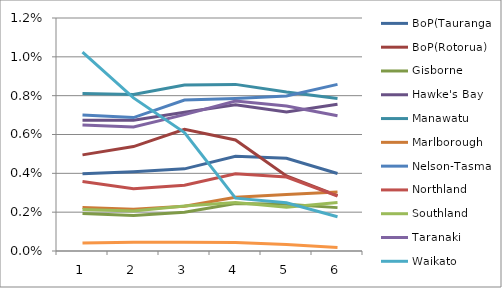
| Category | BoP(Tauranga) | BoP(Rotorua) | Gisborne | Hawke's Bay | Manawatu | Marlborough | Nelson-Tasman | Northland | Southland | Taranaki | Waikato | West Coast |
|---|---|---|---|---|---|---|---|---|---|---|---|---|
| 0 | 0.004 | 0.005 | 0.002 | 0.007 | 0.008 | 0.002 | 0.007 | 0.004 | 0.002 | 0.006 | 0.01 | 0 |
| 1 | 0.004 | 0.005 | 0.002 | 0.007 | 0.008 | 0.002 | 0.007 | 0.003 | 0.002 | 0.006 | 0.008 | 0 |
| 2 | 0.004 | 0.006 | 0.002 | 0.007 | 0.009 | 0.002 | 0.008 | 0.003 | 0.002 | 0.007 | 0.006 | 0 |
| 3 | 0.005 | 0.006 | 0.002 | 0.008 | 0.009 | 0.003 | 0.008 | 0.004 | 0.002 | 0.008 | 0.003 | 0 |
| 4 | 0.005 | 0.004 | 0.002 | 0.007 | 0.008 | 0.003 | 0.008 | 0.004 | 0.002 | 0.007 | 0.002 | 0 |
| 5 | 0.004 | 0.003 | 0.002 | 0.008 | 0.008 | 0.003 | 0.009 | 0.003 | 0.002 | 0.007 | 0.002 | 0 |